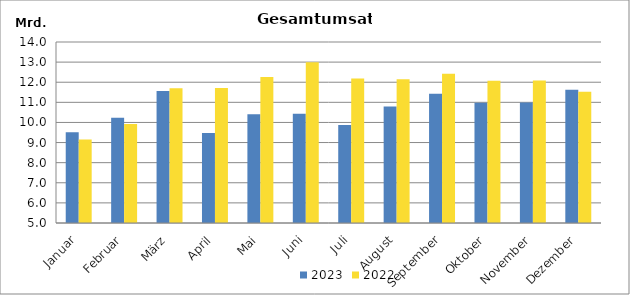
| Category | 2023 | 2022 |
|---|---|---|
| Januar | 9509765.874 | 9153959.513 |
| Februar | 10229033.025 | 9922820.444 |
| März | 11566502.686 | 11697108.856 |
| April | 9479138.693 | 11707339.03 |
| Mai | 10409126.075 | 12261754.805 |
| Juni | 10427630.944 | 12992125.13 |
| Juli | 9874745.303 | 12187262.172 |
| August | 10787274.037 | 12153584.87 |
| September | 11430470.831 | 12418712.275 |
| Oktober | 10984606.867 | 12071794.458 |
| November | 10987084.053 | 12084099.132 |
| Dezember | 11621968.503 | 11529800.399 |